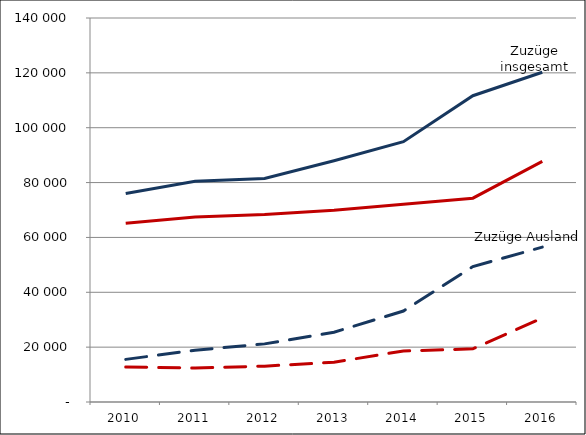
| Category | Zuzüge insgesamt | Zuzüge Ausland | Fortzüge insgesamt | Fortzüge Ausland |
|---|---|---|---|---|
| 2010.0 | 76032 | 15542 | 65209 | 12763 |
| 2011.0 | 80446 | 18887 | 67433 | 12401 |
| 2012.0 | 81472 | 21188 | 68334 | 13076 |
| 2013.0 | 87939 | 25439 | 69872 | 14506 |
| 2014.0 | 94900 | 33167 | 72104 | 18593 |
| 2015.0 | 111661 | 49379 | 74317 | 19376 |
| 2016.0 | 120235 | 56476 | 87754 | 30599 |